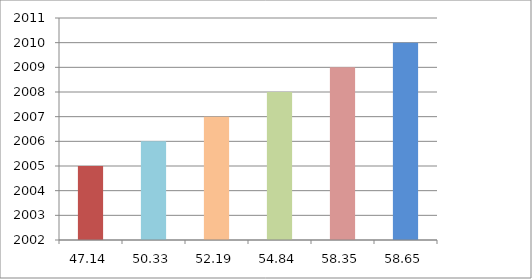
| Category | Series 0 |
|---|---|
| 47.14 | 2005 |
| 50.33 | 2006 |
| 52.19 | 2007 |
| 54.84 | 2008 |
| 58.35 | 2009 |
| 58.65 | 2010 |